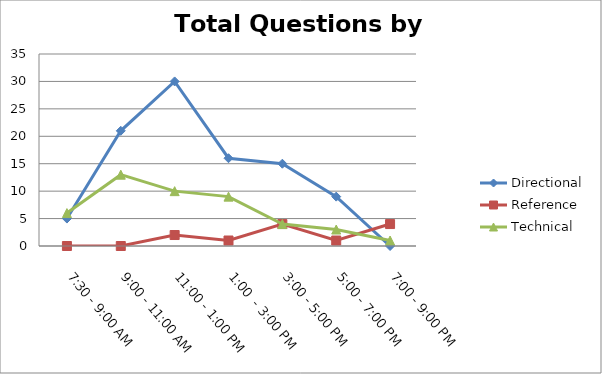
| Category | Directional | Reference | Technical |
|---|---|---|---|
| 7:30 - 9:00 AM | 5 | 0 | 6 |
| 9:00 - 11:00 AM | 21 | 0 | 13 |
| 11:00 - 1:00 PM | 30 | 2 | 10 |
| 1:00  - 3:00 PM | 16 | 1 | 9 |
| 3:00 - 5:00 PM | 15 | 4 | 4 |
| 5:00 - 7:00 PM | 9 | 1 | 3 |
| 7:00 - 9:00 PM | 0 | 4 | 1 |